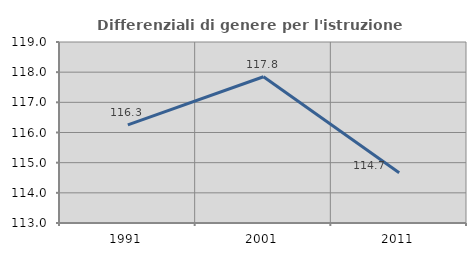
| Category | Differenziali di genere per l'istruzione superiore |
|---|---|
| 1991.0 | 116.256 |
| 2001.0 | 117.847 |
| 2011.0 | 114.666 |